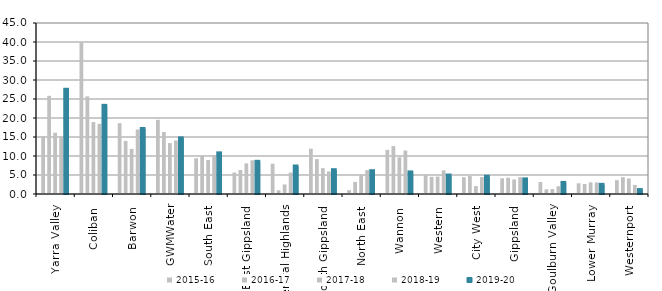
| Category | 2015-16 | 2016-17 | 2017-18 | 2018-19 | 2019-20 |
|---|---|---|---|---|---|
| Yarra Valley  | 15.247 | 25.852 | 16.124 | 15.101 | 27.426 |
| Coliban  | 39.896 | 25.697 | 18.918 | 18.46 | 23.199 |
| Barwon  | 18.617 | 13.964 | 11.861 | 16.964 | 17.099 |
| GWMWater | 19.522 | 16.319 | 13.41 | 14.089 | 14.636 |
| South East  | 9.406 | 10.081 | 8.932 | 10.222 | 10.693 |
| East Gippsland  | 5.644 | 6.313 | 8.062 | 8.861 | 8.47 |
| Central Highlands  | 7.968 | 0.992 | 2.514 | 5.651 | 7.24 |
| South Gippsland  | 11.925 | 9.167 | 6.8 | 5.929 | 6.262 |
| North East  | 1.01 | 3.156 | 5.126 | 6.291 | 5.995 |
| Wannon  | 11.614 | 12.599 | 9.671 | 11.43 | 5.682 |
| Western  | 5.091 | 4.515 | 4.591 | 6.214 | 4.862 |
| City West  | 4.411 | 4.734 | 2.071 | 4.448 | 4.544 |
| Gippsland  | 4.138 | 4.287 | 3.817 | 4.427 | 3.84 |
| Goulburn Valley  | 3.147 | 1.237 | 1.301 | 2.039 | 2.914 |
| Lower Murray  | 2.813 | 2.628 | 3.064 | 3.04 | 2.402 |
| Westernport  | 3.638 | 4.408 | 4.072 | 2.394 | 1.037 |